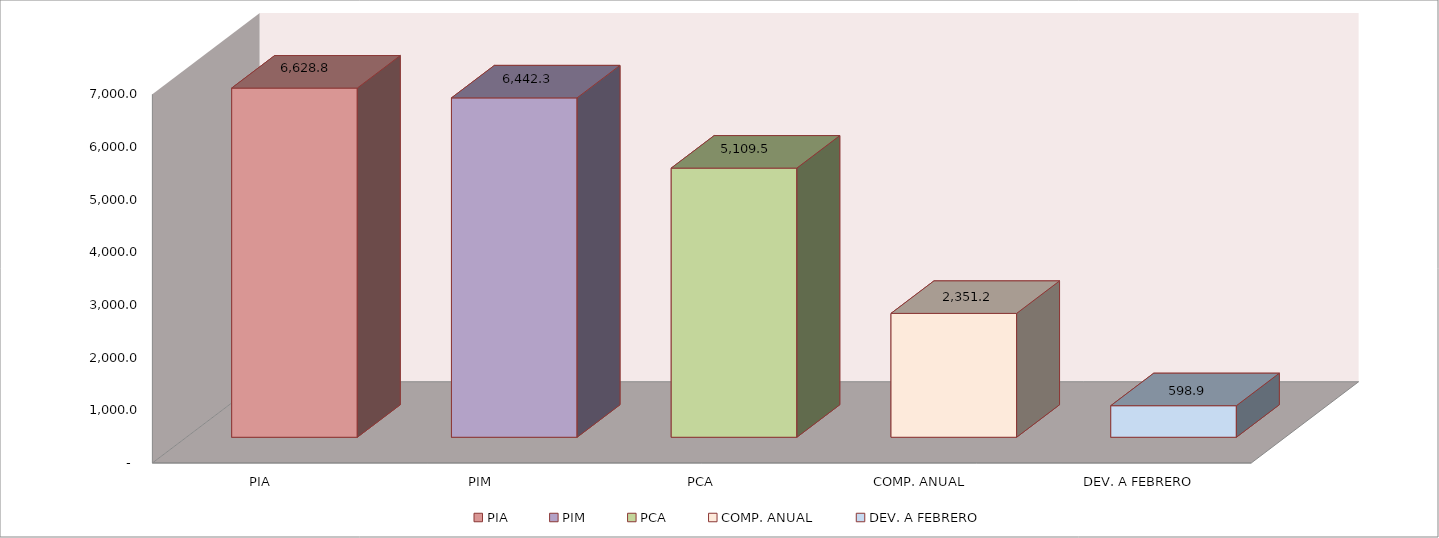
| Category | 011 MINISTERIO DE SALUD |
|---|---|
| PIA | 6628.781 |
| PIM | 6442.325 |
| PCA | 5109.542 |
| COMP. ANUAL | 2351.229 |
| DEV. A FEBRERO | 598.908 |